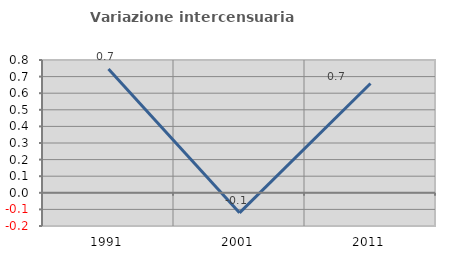
| Category | Variazione intercensuaria annua |
|---|---|
| 1991.0 | 0.746 |
| 2001.0 | -0.121 |
| 2011.0 | 0.658 |